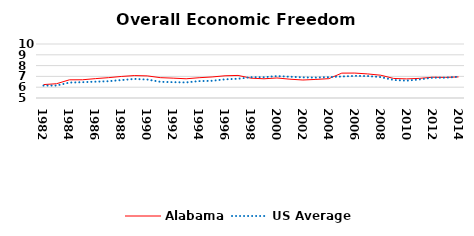
| Category | Alabama  | US Average |
|---|---|---|
| 1982.0 | 6.243 | 6.149 |
| 1983.0 | 6.321 | 6.152 |
| 1984.0 | 6.683 | 6.429 |
| 1985.0 | 6.687 | 6.464 |
| 1986.0 | 6.793 | 6.512 |
| 1987.0 | 6.883 | 6.552 |
| 1988.0 | 6.994 | 6.659 |
| 1989.0 | 7.076 | 6.767 |
| 1990.0 | 7.048 | 6.71 |
| 1991.0 | 6.885 | 6.502 |
| 1992.0 | 6.838 | 6.463 |
| 1993.0 | 6.78 | 6.446 |
| 1994.0 | 6.878 | 6.563 |
| 1995.0 | 6.948 | 6.593 |
| 1996.0 | 7.057 | 6.73 |
| 1997.0 | 7.09 | 6.781 |
| 1998.0 | 6.837 | 6.926 |
| 1999.0 | 6.779 | 6.925 |
| 2000.0 | 6.856 | 7.031 |
| 2001.0 | 6.741 | 6.969 |
| 2002.0 | 6.666 | 6.912 |
| 2003.0 | 6.721 | 6.892 |
| 2004.0 | 6.79 | 6.934 |
| 2005.0 | 7.303 | 6.99 |
| 2006.0 | 7.308 | 7.048 |
| 2007.0 | 7.229 | 7.028 |
| 2008.0 | 7.111 | 6.935 |
| 2009.0 | 6.81 | 6.668 |
| 2010.0 | 6.768 | 6.605 |
| 2011.0 | 6.818 | 6.72 |
| 2012.0 | 6.921 | 6.883 |
| 2013.0 | 6.906 | 6.881 |
| 2014.0 | 6.953 | 6.973 |